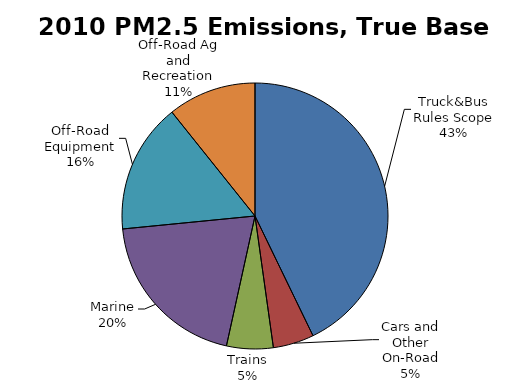
| Category | Series 0 |
|---|---|
| Truck&Bus Rules Scope | 20.774 |
| Cars and Other On-Road | 2.411 |
| Trains | 2.745 |
| Marine | 9.702 |
| Off-Road Equipment | 7.674 |
| Off-Road Ag and Recreation | 5.21 |